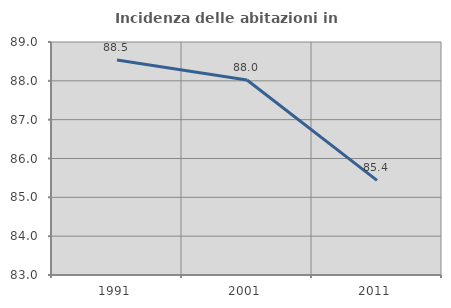
| Category | Incidenza delle abitazioni in proprietà  |
|---|---|
| 1991.0 | 88.534 |
| 2001.0 | 88.023 |
| 2011.0 | 85.436 |